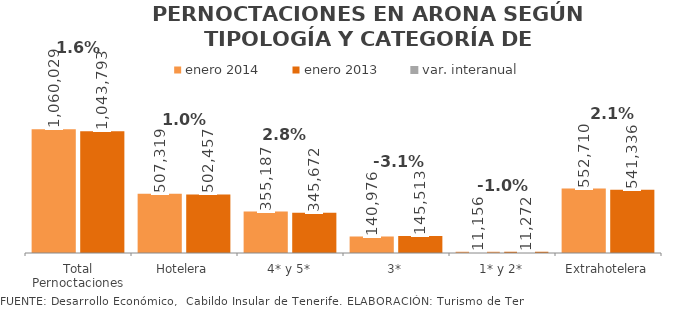
| Category | enero 2014 | enero 2013 |
|---|---|---|
| Total Pernoctaciones | 1060029 | 1043793 |
| Hotelera | 507319 | 502457 |
| 4* y 5* | 355187 | 345672 |
| 3* | 140976 | 145513 |
| 1* y 2* | 11156 | 11272 |
| Extrahotelera | 552710 | 541336 |